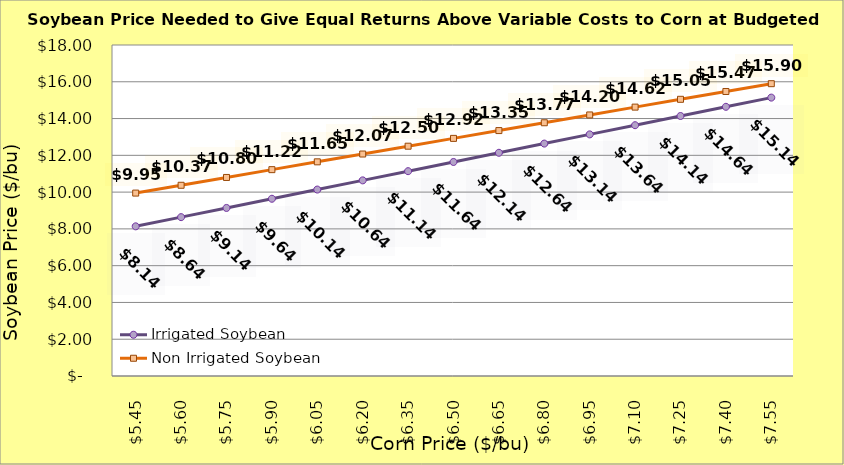
| Category | Irrigated Soybean | Non Irrigated Soybean |
|---|---|---|
| 5.4499999999999975 | 8.139 | 9.947 |
| 5.599999999999998 | 8.639 | 10.372 |
| 5.749999999999998 | 9.139 | 10.797 |
| 5.899999999999999 | 9.639 | 11.222 |
| 6.049999999999999 | 10.139 | 11.647 |
| 6.199999999999999 | 10.639 | 12.072 |
| 6.35 | 11.139 | 12.497 |
| 6.5 | 11.639 | 12.922 |
| 6.65 | 12.139 | 13.347 |
| 6.800000000000001 | 12.639 | 13.772 |
| 6.950000000000001 | 13.139 | 14.197 |
| 7.100000000000001 | 13.639 | 14.622 |
| 7.250000000000002 | 14.139 | 15.047 |
| 7.400000000000002 | 14.639 | 15.472 |
| 7.5500000000000025 | 15.139 | 15.897 |